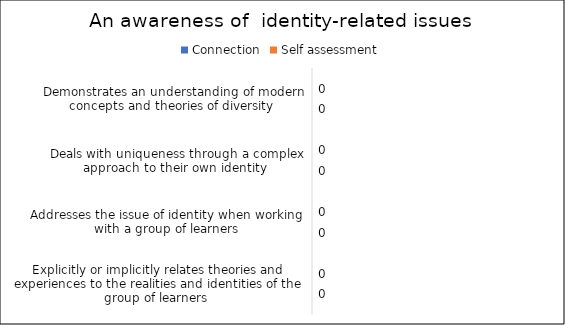
| Category | Connection | Self assessment |
|---|---|---|
| Demonstrates an understanding of modern concepts and theories of diversity  | 0 | 0 |
| Deals with uniqueness through a complex approach to their own identity  | 0 | 0 |
| Addresses the issue of identity when working with a group of learners | 0 | 0 |
| Explicitly or implicitly relates theories and experiences to the realities and identities of the group of learners  | 0 | 0 |